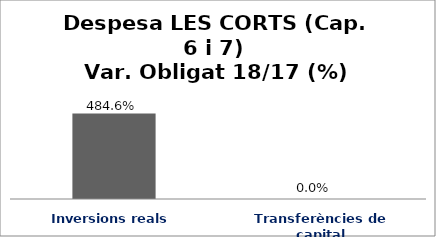
| Category | Series 0 |
|---|---|
| Inversions reals | 4.846 |
| Transferències de capital | 0 |